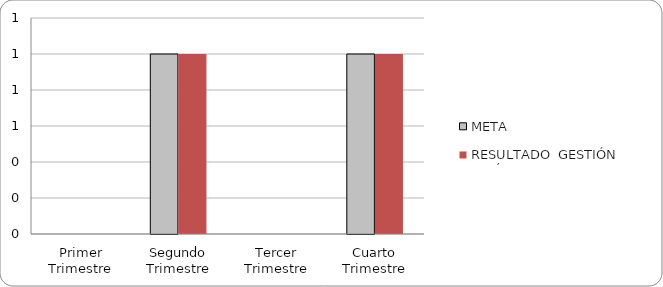
| Category | META | RESULTADO  GESTIÓN PERÍODO |
|---|---|---|
| Primer Trimestre | 0 | 0 |
| Segundo Trimestre | 1 | 1 |
| Tercer Trimestre | 0 | 0 |
| Cuarto Trimestre | 1 | 1 |